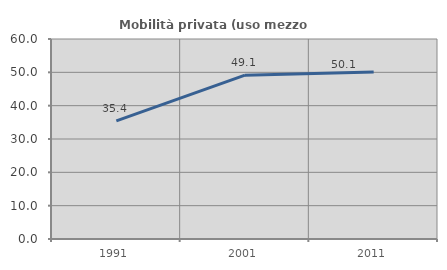
| Category | Mobilità privata (uso mezzo privato) |
|---|---|
| 1991.0 | 35.421 |
| 2001.0 | 49.148 |
| 2011.0 | 50.11 |